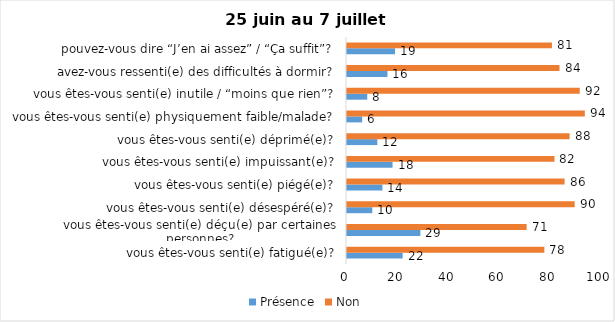
| Category | Présence | Non |
|---|---|---|
| vous êtes-vous senti(e) fatigué(e)? | 22 | 78 |
| vous êtes-vous senti(e) déçu(e) par certaines personnes? | 29 | 71 |
| vous êtes-vous senti(e) désespéré(e)? | 10 | 90 |
| vous êtes-vous senti(e) piégé(e)? | 14 | 86 |
| vous êtes-vous senti(e) impuissant(e)? | 18 | 82 |
| vous êtes-vous senti(e) déprimé(e)? | 12 | 88 |
| vous êtes-vous senti(e) physiquement faible/malade? | 6 | 94 |
| vous êtes-vous senti(e) inutile / “moins que rien”? | 8 | 92 |
| avez-vous ressenti(e) des difficultés à dormir? | 16 | 84 |
| pouvez-vous dire “J’en ai assez” / “Ça suffit”? | 19 | 81 |